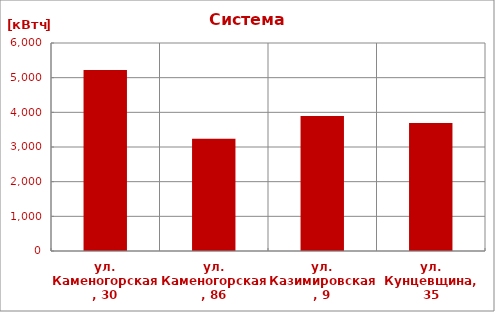
| Category | Series 0 |
|---|---|
| ул. Каменогорская, 30 | 5221.44 |
| ул. Каменогорская, 86 | 3237.984 |
| ул. Казимировская, 9 | 3894 |
| ул. Кунцевщина, 35 | 3692.4 |